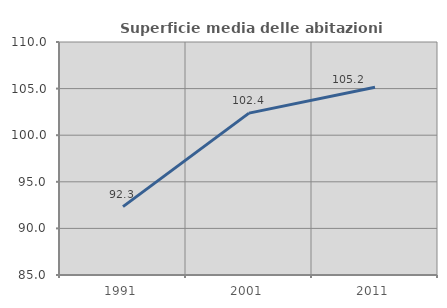
| Category | Superficie media delle abitazioni occupate |
|---|---|
| 1991.0 | 92.339 |
| 2001.0 | 102.365 |
| 2011.0 | 105.155 |